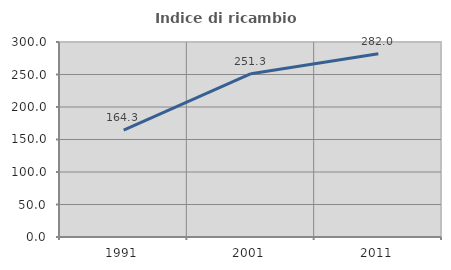
| Category | Indice di ricambio occupazionale  |
|---|---|
| 1991.0 | 164.286 |
| 2001.0 | 251.316 |
| 2011.0 | 282.022 |